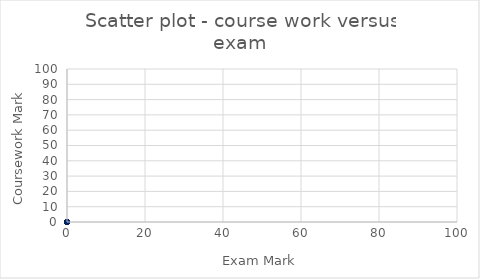
| Category | Numeric Course work |
|---|---|
| 0.0 | 0 |
| 0.0 | 0 |
| 0.0 | 0 |
| 0.0 | 0 |
| 0.0 | 0 |
| 0.0 | 0 |
| 0.0 | 0 |
| 0.0 | 0 |
| 0.0 | 0 |
| 0.0 | 0 |
| 0.0 | 0 |
| 0.0 | 0 |
| 0.0 | 0 |
| 0.0 | 0 |
| 0.0 | 0 |
| 0.0 | 0 |
| 0.0 | 0 |
| 0.0 | 0 |
| 0.0 | 0 |
| 0.0 | 0 |
| 0.0 | 0 |
| 0.0 | 0 |
| 0.0 | 0 |
| 0.0 | 0 |
| 0.0 | 0 |
| 0.0 | 0 |
| 0.0 | 0 |
| 0.0 | 0 |
| 0.0 | 0 |
| 0.0 | 0 |
| 0.0 | 0 |
| 0.0 | 0 |
| 0.0 | 0 |
| 0.0 | 0 |
| 0.0 | 0 |
| 0.0 | 0 |
| 0.0 | 0 |
| 0.0 | 0 |
| 0.0 | 0 |
| 0.0 | 0 |
| 0.0 | 0 |
| 0.0 | 0 |
| 0.0 | 0 |
| 0.0 | 0 |
| 0.0 | 0 |
| 0.0 | 0 |
| 0.0 | 0 |
| 0.0 | 0 |
| 0.0 | 0 |
| 0.0 | 0 |
| 0.0 | 0 |
| 0.0 | 0 |
| 0.0 | 0 |
| 0.0 | 0 |
| 0.0 | 0 |
| 0.0 | 0 |
| 0.0 | 0 |
| 0.0 | 0 |
| 0.0 | 0 |
| 0.0 | 0 |
| 0.0 | 0 |
| 0.0 | 0 |
| 0.0 | 0 |
| 0.0 | 0 |
| 0.0 | 0 |
| 0.0 | 0 |
| 0.0 | 0 |
| 0.0 | 0 |
| 0.0 | 0 |
| 0.0 | 0 |
| 0.0 | 0 |
| 0.0 | 0 |
| 0.0 | 0 |
| 0.0 | 0 |
| 0.0 | 0 |
| 0.0 | 0 |
| 0.0 | 0 |
| 0.0 | 0 |
| 0.0 | 0 |
| 0.0 | 0 |
| 0.0 | 0 |
| 0.0 | 0 |
| 0.0 | 0 |
| 0.0 | 0 |
| 0.0 | 0 |
| 0.0 | 0 |
| 0.0 | 0 |
| 0.0 | 0 |
| 0.0 | 0 |
| 0.0 | 0 |
| 0.0 | 0 |
| 0.0 | 0 |
| 0.0 | 0 |
| 0.0 | 0 |
| 0.0 | 0 |
| 0.0 | 0 |
| 0.0 | 0 |
| 0.0 | 0 |
| 0.0 | 0 |
| 0.0 | 0 |
| 0.0 | 0 |
| 0.0 | 0 |
| 0.0 | 0 |
| 0.0 | 0 |
| 0.0 | 0 |
| 0.0 | 0 |
| 0.0 | 0 |
| 0.0 | 0 |
| 0.0 | 0 |
| 0.0 | 0 |
| 0.0 | 0 |
| 0.0 | 0 |
| 0.0 | 0 |
| 0.0 | 0 |
| 0.0 | 0 |
| 0.0 | 0 |
| 0.0 | 0 |
| 0.0 | 0 |
| 0.0 | 0 |
| 0.0 | 0 |
| 0.0 | 0 |
| 0.0 | 0 |
| 0.0 | 0 |
| 0.0 | 0 |
| 0.0 | 0 |
| 0.0 | 0 |
| 0.0 | 0 |
| 0.0 | 0 |
| 0.0 | 0 |
| 0.0 | 0 |
| 0.0 | 0 |
| 0.0 | 0 |
| 0.0 | 0 |
| 0.0 | 0 |
| 0.0 | 0 |
| 0.0 | 0 |
| 0.0 | 0 |
| 0.0 | 0 |
| 0.0 | 0 |
| 0.0 | 0 |
| 0.0 | 0 |
| 0.0 | 0 |
| 0.0 | 0 |
| 0.0 | 0 |
| 0.0 | 0 |
| 0.0 | 0 |
| 0.0 | 0 |
| 0.0 | 0 |
| 0.0 | 0 |
| 0.0 | 0 |
| 0.0 | 0 |
| 0.0 | 0 |
| 0.0 | 0 |
| 0.0 | 0 |
| 0.0 | 0 |
| 0.0 | 0 |
| 0.0 | 0 |
| 0.0 | 0 |
| 0.0 | 0 |
| 0.0 | 0 |
| 0.0 | 0 |
| 0.0 | 0 |
| 0.0 | 0 |
| 0.0 | 0 |
| 0.0 | 0 |
| 0.0 | 0 |
| 0.0 | 0 |
| 0.0 | 0 |
| 0.0 | 0 |
| 0.0 | 0 |
| 0.0 | 0 |
| 0.0 | 0 |
| 0.0 | 0 |
| 0.0 | 0 |
| 0.0 | 0 |
| 0.0 | 0 |
| 0.0 | 0 |
| 0.0 | 0 |
| 0.0 | 0 |
| 0.0 | 0 |
| 0.0 | 0 |
| 0.0 | 0 |
| 0.0 | 0 |
| 0.0 | 0 |
| 0.0 | 0 |
| 0.0 | 0 |
| 0.0 | 0 |
| 0.0 | 0 |
| 0.0 | 0 |
| 0.0 | 0 |
| 0.0 | 0 |
| 0.0 | 0 |
| 0.0 | 0 |
| 0.0 | 0 |
| 0.0 | 0 |
| 0.0 | 0 |
| 0.0 | 0 |
| 0.0 | 0 |
| 0.0 | 0 |
| 0.0 | 0 |
| 0.0 | 0 |
| 0.0 | 0 |
| 0.0 | 0 |
| 0.0 | 0 |
| 0.0 | 0 |
| 0.0 | 0 |
| 0.0 | 0 |
| 0.0 | 0 |
| 0.0 | 0 |
| 0.0 | 0 |
| 0.0 | 0 |
| 0.0 | 0 |
| 0.0 | 0 |
| 0.0 | 0 |
| 0.0 | 0 |
| 0.0 | 0 |
| 0.0 | 0 |
| 0.0 | 0 |
| 0.0 | 0 |
| 0.0 | 0 |
| 0.0 | 0 |
| 0.0 | 0 |
| 0.0 | 0 |
| 0.0 | 0 |
| 0.0 | 0 |
| 0.0 | 0 |
| 0.0 | 0 |
| 0.0 | 0 |
| 0.0 | 0 |
| 0.0 | 0 |
| 0.0 | 0 |
| 0.0 | 0 |
| 0.0 | 0 |
| 0.0 | 0 |
| 0.0 | 0 |
| 0.0 | 0 |
| 0.0 | 0 |
| 0.0 | 0 |
| 0.0 | 0 |
| 0.0 | 0 |
| 0.0 | 0 |
| 0.0 | 0 |
| 0.0 | 0 |
| 0.0 | 0 |
| 0.0 | 0 |
| 0.0 | 0 |
| 0.0 | 0 |
| 0.0 | 0 |
| 0.0 | 0 |
| 0.0 | 0 |
| 0.0 | 0 |